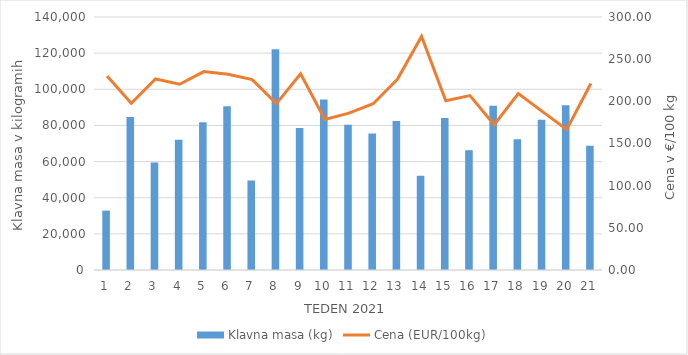
| Category | Klavna masa (kg) |
|---|---|
| 1.0 | 32871 |
| 2.0 | 84639 |
| 3.0 | 59476 |
| 4.0 | 72013 |
| 5.0 | 81759 |
| 6.0 | 90669 |
| 7.0 | 49517 |
| 8.0 | 122111 |
| 9.0 | 78545 |
| 10.0 | 94384 |
| 11.0 | 80405 |
| 12.0 | 75534 |
| 13.0 | 82440 |
| 14.0 | 52143 |
| 15.0 | 84105 |
| 16.0 | 66298 |
| 17.0 | 90925 |
| 18.0 | 72394 |
| 19.0 | 83193 |
| 20.0 | 91231 |
| 21.0 | 68763 |